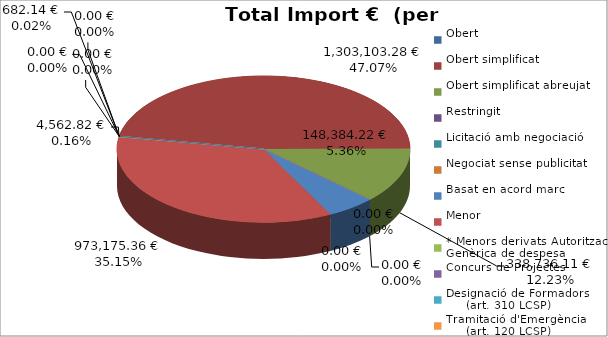
| Category | Total preu
(amb IVA) |
|---|---|
| Obert | 682.14 |
| Obert simplificat | 1303103.28 |
| Obert simplificat abreujat | 338736.11 |
| Restringit | 0 |
| Licitació amb negociació | 0 |
| Negociat sense publicitat | 0 |
| Basat en acord marc | 148384.22 |
| Menor | 973175.36 |
| * Menors derivats Autorització Genèrica de despesa | 4562.82 |
| Concurs de Projectes | 0 |
| Designació de Formadors
     (art. 310 LCSP) | 0 |
| Tramitació d'Emergència
     (art. 120 LCSP) | 0 |